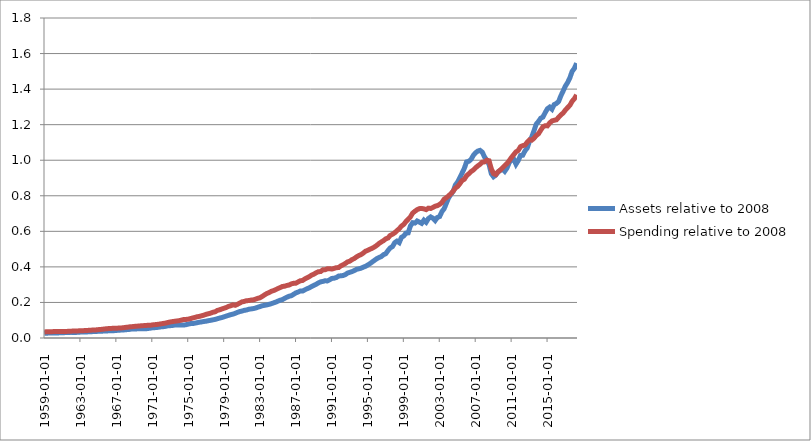
| Category | Assets relative to 2008 | Spending relative to 2008 |
|---|---|---|
| 1959-01-01 | 0.027 | 0.034 |
| 1959-04-01 | 0.027 | 0.035 |
| 1959-07-01 | 0.028 | 0.035 |
| 1959-10-01 | 0.028 | 0.036 |
| 1960-01-01 | 0.028 | 0.036 |
| 1960-04-01 | 0.028 | 0.037 |
| 1960-07-01 | 0.028 | 0.036 |
| 1960-10-01 | 0.029 | 0.036 |
| 1961-01-01 | 0.03 | 0.036 |
| 1961-04-01 | 0.03 | 0.037 |
| 1961-07-01 | 0.031 | 0.037 |
| 1961-10-01 | 0.031 | 0.038 |
| 1962-01-01 | 0.032 | 0.039 |
| 1962-04-01 | 0.031 | 0.039 |
| 1962-07-01 | 0.031 | 0.039 |
| 1962-10-01 | 0.033 | 0.04 |
| 1963-01-01 | 0.033 | 0.04 |
| 1963-04-01 | 0.034 | 0.041 |
| 1963-07-01 | 0.034 | 0.042 |
| 1963-10-01 | 0.034 | 0.042 |
| 1964-01-01 | 0.035 | 0.043 |
| 1964-04-01 | 0.036 | 0.044 |
| 1964-07-01 | 0.036 | 0.045 |
| 1964-10-01 | 0.037 | 0.046 |
| 1965-01-01 | 0.037 | 0.047 |
| 1965-04-01 | 0.038 | 0.048 |
| 1965-07-01 | 0.039 | 0.049 |
| 1965-10-01 | 0.04 | 0.051 |
| 1966-01-01 | 0.04 | 0.053 |
| 1966-04-01 | 0.04 | 0.053 |
| 1966-07-01 | 0.04 | 0.054 |
| 1966-10-01 | 0.041 | 0.055 |
| 1967-01-01 | 0.043 | 0.055 |
| 1967-04-01 | 0.043 | 0.056 |
| 1967-07-01 | 0.044 | 0.056 |
| 1967-10-01 | 0.046 | 0.057 |
| 1968-01-01 | 0.046 | 0.06 |
| 1968-04-01 | 0.048 | 0.061 |
| 1968-07-01 | 0.049 | 0.063 |
| 1968-10-01 | 0.051 | 0.064 |
| 1969-01-01 | 0.051 | 0.065 |
| 1969-04-01 | 0.051 | 0.066 |
| 1969-07-01 | 0.052 | 0.067 |
| 1969-10-01 | 0.052 | 0.068 |
| 1970-01-01 | 0.052 | 0.069 |
| 1970-04-01 | 0.052 | 0.07 |
| 1970-07-01 | 0.053 | 0.071 |
| 1970-10-01 | 0.055 | 0.071 |
| 1971-01-01 | 0.057 | 0.073 |
| 1971-04-01 | 0.058 | 0.075 |
| 1971-07-01 | 0.059 | 0.076 |
| 1971-10-01 | 0.061 | 0.078 |
| 1972-01-01 | 0.063 | 0.08 |
| 1972-04-01 | 0.064 | 0.082 |
| 1972-07-01 | 0.066 | 0.084 |
| 1972-10-01 | 0.069 | 0.087 |
| 1973-01-01 | 0.069 | 0.09 |
| 1973-04-01 | 0.07 | 0.092 |
| 1973-07-01 | 0.073 | 0.094 |
| 1973-10-01 | 0.072 | 0.096 |
| 1974-01-01 | 0.073 | 0.098 |
| 1974-04-01 | 0.073 | 0.1 |
| 1974-07-01 | 0.073 | 0.104 |
| 1974-10-01 | 0.075 | 0.104 |
| 1975-01-01 | 0.078 | 0.106 |
| 1975-04-01 | 0.081 | 0.109 |
| 1975-07-01 | 0.081 | 0.113 |
| 1975-10-01 | 0.084 | 0.116 |
| 1976-01-01 | 0.086 | 0.119 |
| 1976-04-01 | 0.089 | 0.122 |
| 1976-07-01 | 0.09 | 0.125 |
| 1976-10-01 | 0.093 | 0.128 |
| 1977-01-01 | 0.095 | 0.133 |
| 1977-04-01 | 0.097 | 0.136 |
| 1977-07-01 | 0.1 | 0.14 |
| 1977-10-01 | 0.102 | 0.145 |
| 1978-01-01 | 0.105 | 0.147 |
| 1978-04-01 | 0.108 | 0.155 |
| 1978-07-01 | 0.112 | 0.159 |
| 1978-10-01 | 0.115 | 0.163 |
| 1979-01-01 | 0.119 | 0.168 |
| 1979-04-01 | 0.123 | 0.172 |
| 1979-07-01 | 0.127 | 0.178 |
| 1979-10-01 | 0.131 | 0.181 |
| 1980-01-01 | 0.134 | 0.186 |
| 1980-04-01 | 0.139 | 0.184 |
| 1980-07-01 | 0.144 | 0.19 |
| 1980-10-01 | 0.149 | 0.197 |
| 1981-01-01 | 0.152 | 0.203 |
| 1981-04-01 | 0.156 | 0.206 |
| 1981-07-01 | 0.157 | 0.21 |
| 1981-10-01 | 0.162 | 0.21 |
| 1982-01-01 | 0.163 | 0.213 |
| 1982-04-01 | 0.165 | 0.215 |
| 1982-07-01 | 0.168 | 0.218 |
| 1982-10-01 | 0.173 | 0.223 |
| 1983-01-01 | 0.177 | 0.226 |
| 1983-04-01 | 0.181 | 0.234 |
| 1983-07-01 | 0.184 | 0.242 |
| 1983-10-01 | 0.186 | 0.25 |
| 1984-01-01 | 0.189 | 0.255 |
| 1984-04-01 | 0.193 | 0.262 |
| 1984-07-01 | 0.197 | 0.266 |
| 1984-10-01 | 0.202 | 0.272 |
| 1985-01-01 | 0.207 | 0.278 |
| 1985-04-01 | 0.212 | 0.284 |
| 1985-07-01 | 0.216 | 0.29 |
| 1985-10-01 | 0.223 | 0.291 |
| 1986-01-01 | 0.23 | 0.296 |
| 1986-04-01 | 0.235 | 0.298 |
| 1986-07-01 | 0.238 | 0.305 |
| 1986-10-01 | 0.246 | 0.308 |
| 1987-01-01 | 0.254 | 0.308 |
| 1987-04-01 | 0.259 | 0.316 |
| 1987-07-01 | 0.265 | 0.322 |
| 1987-10-01 | 0.264 | 0.324 |
| 1988-01-01 | 0.271 | 0.332 |
| 1988-04-01 | 0.277 | 0.339 |
| 1988-07-01 | 0.282 | 0.345 |
| 1988-10-01 | 0.29 | 0.354 |
| 1989-01-01 | 0.296 | 0.359 |
| 1989-04-01 | 0.302 | 0.367 |
| 1989-07-01 | 0.31 | 0.373 |
| 1989-10-01 | 0.316 | 0.374 |
| 1990-01-01 | 0.318 | 0.383 |
| 1990-04-01 | 0.322 | 0.384 |
| 1990-07-01 | 0.321 | 0.389 |
| 1990-10-01 | 0.327 | 0.39 |
| 1991-01-01 | 0.335 | 0.388 |
| 1991-04-01 | 0.336 | 0.391 |
| 1991-07-01 | 0.34 | 0.396 |
| 1991-10-01 | 0.348 | 0.396 |
| 1992-01-01 | 0.35 | 0.406 |
| 1992-04-01 | 0.351 | 0.412 |
| 1992-07-01 | 0.357 | 0.419 |
| 1992-10-01 | 0.365 | 0.428 |
| 1993-01-01 | 0.369 | 0.432 |
| 1993-04-01 | 0.374 | 0.441 |
| 1993-07-01 | 0.379 | 0.447 |
| 1993-10-01 | 0.386 | 0.456 |
| 1994-01-01 | 0.389 | 0.464 |
| 1994-04-01 | 0.393 | 0.469 |
| 1994-07-01 | 0.398 | 0.478 |
| 1994-10-01 | 0.403 | 0.488 |
| 1995-01-01 | 0.411 | 0.493 |
| 1995-04-01 | 0.418 | 0.499 |
| 1995-07-01 | 0.428 | 0.505 |
| 1995-10-01 | 0.437 | 0.512 |
| 1996-01-01 | 0.446 | 0.521 |
| 1996-04-01 | 0.453 | 0.532 |
| 1996-07-01 | 0.458 | 0.54 |
| 1996-10-01 | 0.469 | 0.548 |
| 1997-01-01 | 0.474 | 0.558 |
| 1997-04-01 | 0.492 | 0.562 |
| 1997-07-01 | 0.507 | 0.577 |
| 1997-10-01 | 0.514 | 0.584 |
| 1998-01-01 | 0.536 | 0.592 |
| 1998-04-01 | 0.545 | 0.604 |
| 1998-07-01 | 0.536 | 0.614 |
| 1998-10-01 | 0.566 | 0.63 |
| 1999-01-01 | 0.574 | 0.639 |
| 1999-04-01 | 0.59 | 0.655 |
| 1999-07-01 | 0.591 | 0.668 |
| 1999-10-01 | 0.631 | 0.682 |
| 2000-01-01 | 0.649 | 0.703 |
| 2000-04-01 | 0.647 | 0.713 |
| 2000-07-01 | 0.658 | 0.722 |
| 2000-10-01 | 0.652 | 0.728 |
| 2001-01-01 | 0.645 | 0.729 |
| 2001-04-01 | 0.663 | 0.726 |
| 2001-07-01 | 0.651 | 0.722 |
| 2001-10-01 | 0.672 | 0.73 |
| 2002-01-01 | 0.681 | 0.729 |
| 2002-04-01 | 0.674 | 0.734 |
| 2002-07-01 | 0.661 | 0.741 |
| 2002-10-01 | 0.678 | 0.745 |
| 2003-01-01 | 0.683 | 0.752 |
| 2003-04-01 | 0.711 | 0.761 |
| 2003-07-01 | 0.727 | 0.781 |
| 2003-10-01 | 0.758 | 0.789 |
| 2004-01-01 | 0.789 | 0.8 |
| 2004-04-01 | 0.807 | 0.811 |
| 2004-07-01 | 0.824 | 0.825 |
| 2004-10-01 | 0.86 | 0.843 |
| 2005-01-01 | 0.877 | 0.852 |
| 2005-04-01 | 0.901 | 0.868 |
| 2005-07-01 | 0.928 | 0.886 |
| 2005-10-01 | 0.954 | 0.893 |
| 2006-01-01 | 0.991 | 0.913 |
| 2006-04-01 | 0.994 | 0.924 |
| 2006-07-01 | 1.005 | 0.936 |
| 2006-10-01 | 1.027 | 0.945 |
| 2007-01-01 | 1.042 | 0.958 |
| 2007-04-01 | 1.051 | 0.968 |
| 2007-07-01 | 1.055 | 0.977 |
| 2007-10-01 | 1.045 | 0.989 |
| 2008-01-01 | 1.018 | 0.991 |
| 2008-04-01 | 1 | 1 |
| 2008-07-01 | 0.977 | 0.997 |
| 2008-10-01 | 0.924 | 0.952 |
| 2009-01-01 | 0.907 | 0.925 |
| 2009-04-01 | 0.917 | 0.919 |
| 2009-07-01 | 0.933 | 0.935 |
| 2009-10-01 | 0.943 | 0.945 |
| 2010-01-01 | 0.951 | 0.957 |
| 2010-04-01 | 0.938 | 0.97 |
| 2010-07-01 | 0.956 | 0.981 |
| 2010-10-01 | 0.987 | 0.998 |
| 2011-01-01 | 1.002 | 1.016 |
| 2011-04-01 | 1.006 | 1.031 |
| 2011-07-01 | 0.978 | 1.047 |
| 2011-10-01 | 0.998 | 1.055 |
| 2012-01-01 | 1.026 | 1.076 |
| 2012-04-01 | 1.028 | 1.082 |
| 2012-07-01 | 1.053 | 1.085 |
| 2012-10-01 | 1.069 | 1.101 |
| 2013-01-01 | 1.107 | 1.114 |
| 2013-04-01 | 1.13 | 1.113 |
| 2013-07-01 | 1.165 | 1.123 |
| 2013-10-01 | 1.203 | 1.139 |
| 2014-01-01 | 1.218 | 1.149 |
| 2014-04-01 | 1.237 | 1.169 |
| 2014-07-01 | 1.243 | 1.188 |
| 2014-10-01 | 1.268 | 1.194 |
| 2015-01-01 | 1.29 | 1.193 |
| 2015-04-01 | 1.299 | 1.21 |
| 2015-07-01 | 1.287 | 1.221 |
| 2015-10-01 | 1.313 | 1.225 |
| 2016-01-01 | 1.319 | 1.227 |
| 2016-04-01 | 1.331 | 1.242 |
| 2016-07-01 | 1.363 | 1.255 |
| 2016-10-01 | 1.389 | 1.266 |
| 2017-01-01 | 1.417 | 1.282 |
| 2017-04-01 | 1.437 | 1.296 |
| 2017-07-01 | 1.464 | 1.309 |
| 2017-10-01 | 1.5 | 1.332 |
| 2018-01-01 | 1.517 | 1.346 |
| 2018-04-01 | 1.546 | 1.368 |